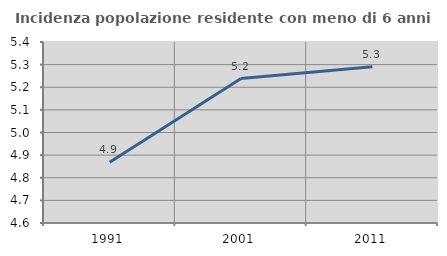
| Category | Incidenza popolazione residente con meno di 6 anni |
|---|---|
| 1991.0 | 4.869 |
| 2001.0 | 5.239 |
| 2011.0 | 5.291 |